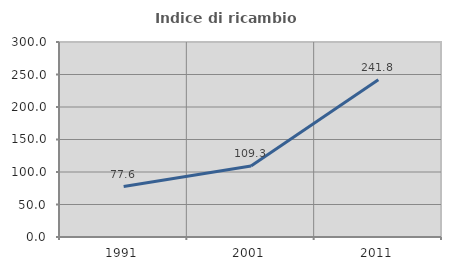
| Category | Indice di ricambio occupazionale  |
|---|---|
| 1991.0 | 77.638 |
| 2001.0 | 109.337 |
| 2011.0 | 241.758 |